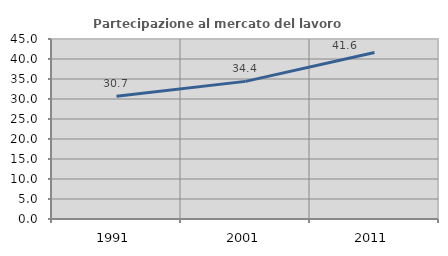
| Category | Partecipazione al mercato del lavoro  femminile |
|---|---|
| 1991.0 | 30.682 |
| 2001.0 | 34.404 |
| 2011.0 | 41.612 |